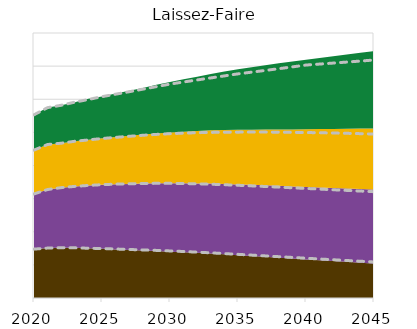
| Category | Ref Coal | Ref Oil | Ref Gas | Ref Ren |
|---|---|---|---|---|
| 0 | 73.761 | 83.308 | 66.174 | 53.297 |
| 1 | 75.357 | 88.371 | 67.995 | 55.647 |
| 2 | 75.925 | 90.651 | 67.064 | 57.255 |
| 3 | 75.705 | 92.783 | 68.093 | 59.058 |
| 4 | 75.121 | 94.792 | 68.713 | 61.007 |
| 5 | 74.623 | 96.447 | 69.649 | 63.184 |
| 6 | 73.948 | 97.893 | 70.626 | 65.159 |
| 7 | 73.243 | 99.156 | 71.671 | 67.294 |
| 8 | 72.564 | 100.281 | 72.761 | 69.601 |
| 9 | 71.846 | 101.221 | 73.864 | 72.118 |
| 10 | 71.057 | 101.983 | 74.972 | 74.881 |
| 11 | 70.175 | 102.618 | 76.072 | 77.19 |
| 12 | 69.203 | 103.148 | 77.153 | 79.642 |
| 13 | 68.154 | 103.588 | 78.208 | 82.248 |
| 14 | 67.037 | 103.954 | 79.231 | 85.021 |
| 15 | 65.891 | 104.255 | 80.219 | 87.976 |
| 16 | 64.73 | 104.524 | 81.168 | 90.475 |
| 17 | 63.558 | 104.76 | 82.069 | 93.108 |
| 18 | 62.386 | 104.964 | 82.898 | 95.883 |
| 19 | 61.216 | 105.145 | 83.672 | 98.812 |
| 20 | 60.048 | 105.33 | 84.388 | 101.861 |
| 21 | 58.882 | 105.504 | 85.042 | 103.681 |
| 22 | 57.737 | 105.661 | 85.634 | 105.574 |
| 23 | 56.605 | 105.806 | 86.162 | 107.544 |
| 24 | 55.489 | 105.942 | 86.626 | 109.596 |
| 25 | 54.388 | 106.07 | 87.029 | 111.734 |